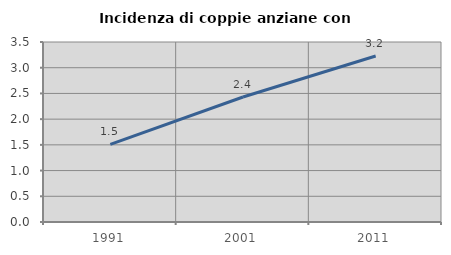
| Category | Incidenza di coppie anziane con figli |
|---|---|
| 1991.0 | 1.51 |
| 2001.0 | 2.431 |
| 2011.0 | 3.227 |